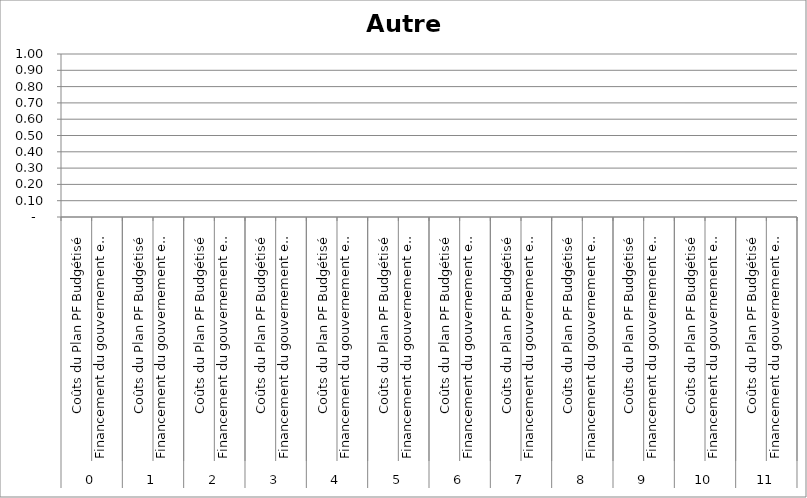
| Category | Autre 3 |
|---|---|
| 0 | 0 |
| 1 | 0 |
| 2 | 0 |
| 3 | 0 |
| 4 | 0 |
| 5 | 0 |
| 6 | 0 |
| 7 | 0 |
| 8 | 0 |
| 9 | 0 |
| 10 | 0 |
| 11 | 0 |
| 12 | 0 |
| 13 | 0 |
| 14 | 0 |
| 15 | 0 |
| 16 | 0 |
| 17 | 0 |
| 18 | 0 |
| 19 | 0 |
| 20 | 0 |
| 21 | 0 |
| 22 | 0 |
| 23 | 0 |